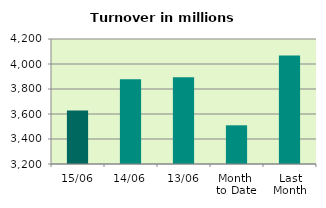
| Category | Series 0 |
|---|---|
| 15/06 | 3628.013 |
| 14/06 | 3878.085 |
| 13/06 | 3893.818 |
| Month 
to Date | 3509.664 |
| Last
Month | 4067.502 |